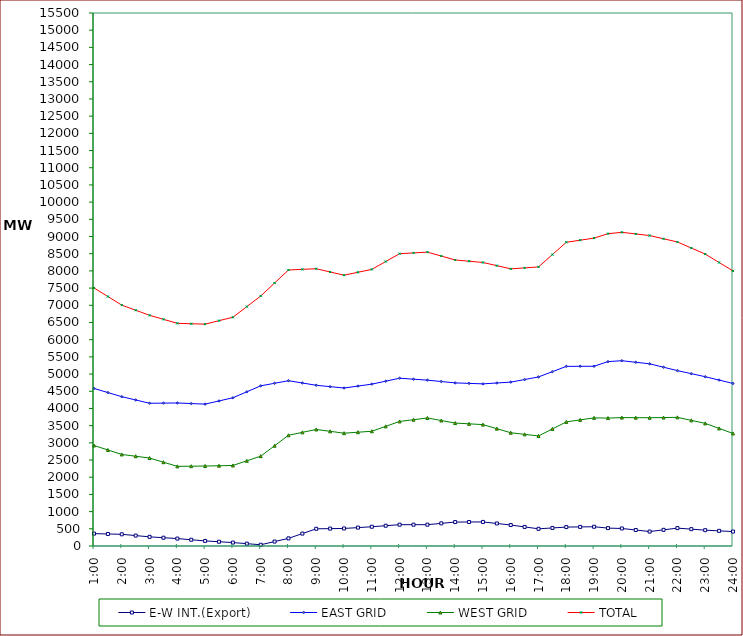
| Category | E-W INT.(Export) | EAST GRID | WEST GRID | TOTAL |
|---|---|---|---|---|
| 1:00 | 360 | 4582 | 2923 | 7505 |
| 1:30 | 350 | 4462 | 2792.5 | 7254.5 |
| 2:00 | 340 | 4342 | 2662 | 7004 |
| 2:30 | 303 | 4246.5 | 2610 | 6856.5 |
| 3:00 | 266 | 4151 | 2558 | 6709 |
| 3:30 | 241 | 4155 | 2437 | 6592 |
| 4:00 | 216 | 4159 | 2316 | 6475 |
| 4:30 | 182 | 4142.5 | 2321 | 6463.5 |
| 5:00 | 148 | 4126 | 2326 | 6452 |
| 5:30 | 124 | 4218.5 | 2334 | 6552.5 |
| 6:00 | 100 | 4311 | 2342 | 6653 |
| 6:30 | 68 | 4484 | 2477 | 6961 |
| 7:00 | 36 | 4657 | 2612 | 7269 |
| 7:30 | 129 | 4732 | 2916 | 7648 |
| 8:00 | 222 | 4807 | 3220 | 8027 |
| 8:30 | 361 | 4740.5 | 3304.5 | 8045 |
| 9:00 | 500 | 4674 | 3389 | 8063 |
| 9:30 | 505 | 4634 | 3335 | 7969 |
| 10:00 | 510 | 4594 | 3281 | 7875 |
| 10:30 | 535 | 4650.5 | 3309 | 7959.5 |
| 11:00 | 560 | 4707 | 3337 | 8044 |
| 11:30 | 590 | 4793 | 3479.5 | 8272.5 |
| 12:00 | 620 | 4879 | 3622 | 8501 |
| 12:30 | 620 | 4851 | 3672.5 | 8523.5 |
| 13:00 | 620 | 4823 | 3723 | 8546 |
| 13:30 | 658 | 4783 | 3649 | 8432 |
| 14:00 | 696 | 4743 | 3575 | 8318 |
| 14:30 | 698 | 4729 | 3552.5 | 8281.5 |
| 15:00 | 700 | 4715 | 3530 | 8245 |
| 15:30 | 655 | 4740.5 | 3412 | 8152.5 |
| 16:00 | 610 | 4766 | 3294 | 8060 |
| 16:30 | 555 | 4841 | 3247 | 8088 |
| 17:00 | 500 | 4916 | 3200 | 8116 |
| 17:30 | 525 | 5070 | 3404.5 | 8474.5 |
| 18:00 | 550 | 5224 | 3609 | 8833 |
| 18:30 | 555 | 5225.5 | 3667.5 | 8893 |
| 19:00 | 560 | 5227 | 3726 | 8953 |
| 19:30 | 520 | 5362 | 3720 | 9082 |
| 20:00 | 510 | 5388 | 3734 | 9122 |
| 20:30 | 465 | 5343 | 3732 | 9075 |
| 21:00 | 420 | 5298 | 3730 | 9028 |
| 21:30 | 470 | 5199 | 3735.5 | 8934.5 |
| 22:00 | 520 | 5100 | 3741 | 8841 |
| 22:30 | 490 | 5011.5 | 3653.5 | 8665 |
| 23:00 | 460 | 4923 | 3566 | 8489 |
| 23:30 | 440 | 4825 | 3419.5 | 8244.5 |
| 24:00 | 420 | 4727 | 3273 | 8000 |